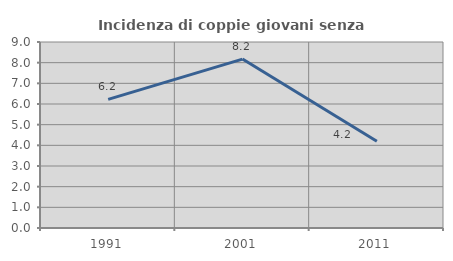
| Category | Incidenza di coppie giovani senza figli |
|---|---|
| 1991.0 | 6.223 |
| 2001.0 | 8.173 |
| 2011.0 | 4.194 |